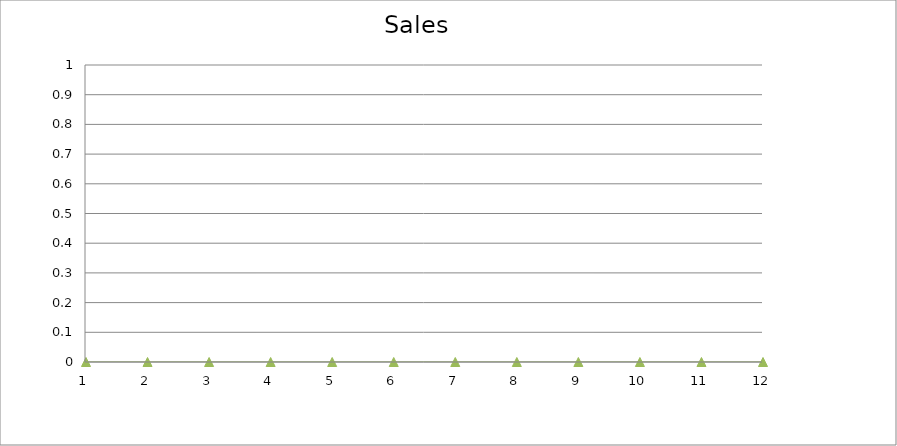
| Category | Actual |
|---|---|
| 0 | 3180 |
| 1 | 1950 |
| 2 | 2190 |
| 3 | 1480 |
| 4 | 2660 |
| 5 | 1480 |
| 6 | 570 |
| 7 | 2210 |
| 8 | 3170 |
| 9 | 830 |
| 10 | 3100 |
| 11 | 610 |